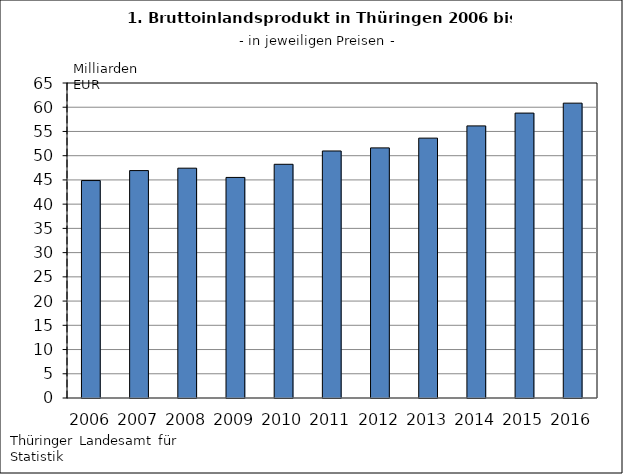
| Category | 44,868622 |
|---|---|
| 2006.0 | 44.869 |
| 2007.0 | 46.928 |
| 2008.0 | 47.423 |
| 2009.0 | 45.513 |
| 2010.0 | 48.225 |
| 2011.0 | 50.972 |
| 2012.0 | 51.612 |
| 2013.0 | 53.622 |
| 2014.0 | 56.146 |
| 2015.0 | 58.793 |
| 2016.0 | 60.843 |